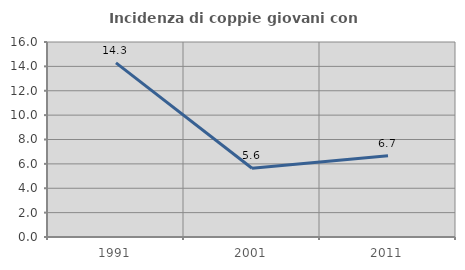
| Category | Incidenza di coppie giovani con figli |
|---|---|
| 1991.0 | 14.286 |
| 2001.0 | 5.638 |
| 2011.0 | 6.667 |